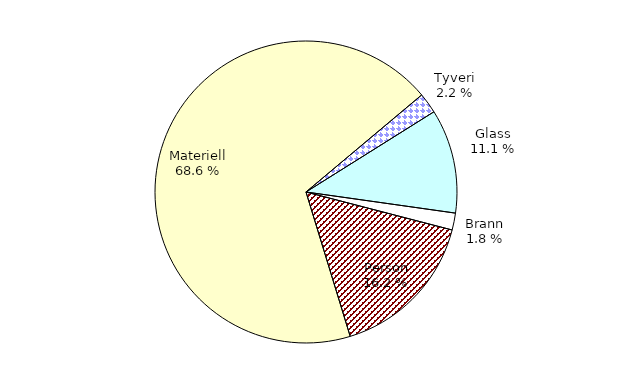
| Category | Series 0 |
|---|---|
| Tyveri | 141.668 |
| Glass | 718.648 |
| Brann | 116.901 |
| Person | 1045.742 |
| Materiell | 4423.22 |